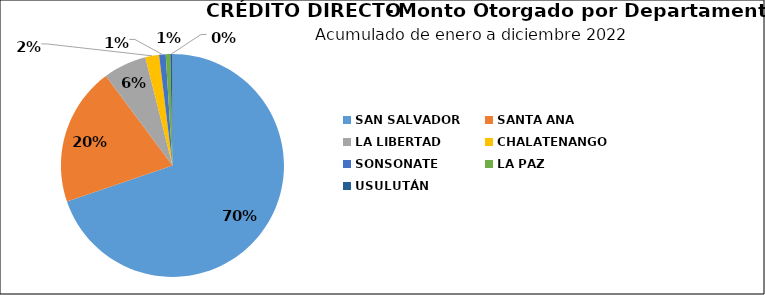
| Category | Monto | Créditos |
|---|---|---|
| SAN SALVADOR | 36.165 | 17 |
| SANTA ANA | 10.387 | 7 |
| LA LIBERTAD | 3.252 | 2 |
| CHALATENANGO | 1.033 | 4 |
| SONSONATE | 0.494 | 2 |
| LA PAZ | 0.344 | 2 |
| USULUTÁN | 0.16 | 1 |